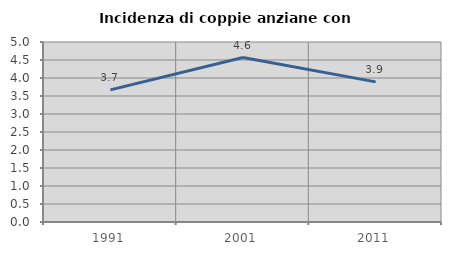
| Category | Incidenza di coppie anziane con figli |
|---|---|
| 1991.0 | 3.67 |
| 2001.0 | 4.567 |
| 2011.0 | 3.893 |